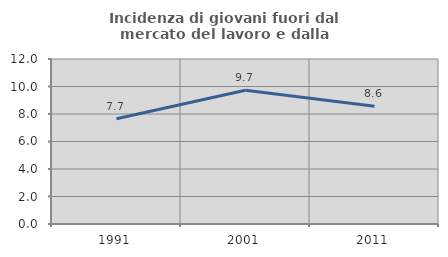
| Category | Incidenza di giovani fuori dal mercato del lavoro e dalla formazione  |
|---|---|
| 1991.0 | 7.658 |
| 2001.0 | 9.722 |
| 2011.0 | 8.563 |